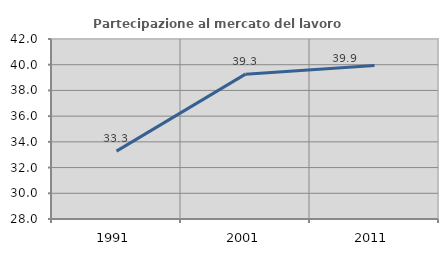
| Category | Partecipazione al mercato del lavoro  femminile |
|---|---|
| 1991.0 | 33.281 |
| 2001.0 | 39.267 |
| 2011.0 | 39.936 |